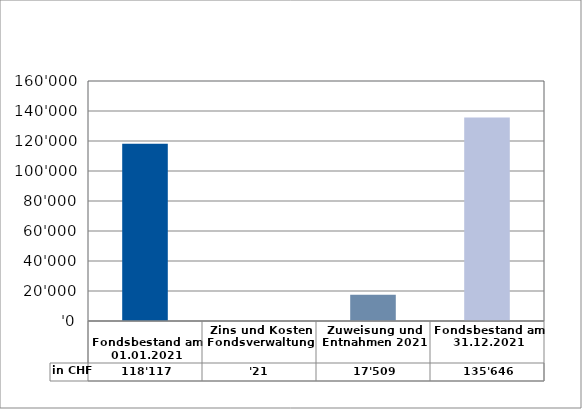
| Category | in CHF |
|---|---|
| 
Fondsbestand am 01.01.2021

 | 118116.5 |
| Zins und Kosten Fondsverwaltung | 20.65 |
| Zuweisung und Entnahmen 2021 | 17509 |
| Fondsbestand am 31.12.2021 | 135646.15 |